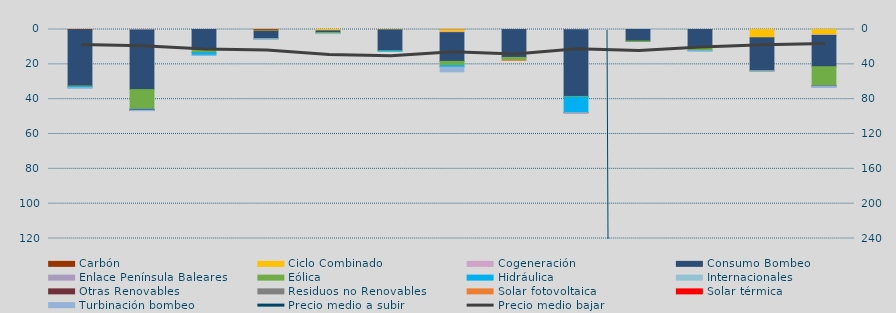
| Category | Carbón | Ciclo Combinado | Cogeneración | Consumo Bombeo | Enlace Península Baleares | Eólica | Hidráulica | Internacionales | Otras Renovables | Residuos no Renovables | Solar fotovoltaica | Solar térmica | Turbinación bombeo |
|---|---|---|---|---|---|---|---|---|---|---|---|---|---|
| 0 | 350.4 | 0 | 0 | 32084.5 | 0 | 425.7 | 531.2 | 0 | 0 | 0 | 0 | 0 | 413.1 |
| 1 | 0 | 90 | 154.4 | 34261.7 | 0 | 11163.7 | 589.5 | 0 | 122.2 | 0 | 0 | 44.1 | 171.5 |
| 2 | 0 | 0 | 0 | 11426.8 | 0 | 1911.2 | 1375.3 | 0 | 0 | 0 | 0 | 0 | 67.5 |
| 3 | 482 | 368.5 | 0 | 4415 | 0 | 113.2 | 0 | 0 | 0 | 0 | 0 | 0 | 368.4 |
| 4 | 0 | 796.6 | 0 | 914.2 | 0 | 550.1 | 8.9 | 0 | 0 | 0 | 0 | 0 | 104 |
| 5 | 0 | 211.3 | 0 | 11981.8 | 0 | 74 | 8.3 | 0 | 0 | 0 | 0 | 0 | 0 |
| 6 | 91.8 | 1302.4 | 400.2 | 16524.6 | 0 | 2415.4 | 873.5 | 0 | 0 | 0 | 0 | 0 | 2690.2 |
| 7 | 0 | 0 | 27.2 | 16019.9 | 60 | 1518.5 | 0 | 0 | 0 | 0 | 0.9 | 0 | 0 |
| 8 | 0 | 0 | 106.8 | 38332.5 | 0 | 408.2 | 8886.3 | 0 | 30.1 | 3.6 | 0 | 0 | 44 |
| 9 | 0 | 0 | 0 | 6628.9 | 0 | 183.2 | 0 | 0 | 0 | 0 | 0 | 0 | 0 |
| 10 | 0 | 1.3 | 0 | 10386.9 | 0 | 1741.8 | 75 | 0 | 0 | 0 | 0 | 0 | 139.3 |
| 11 | 0 | 4765.8 | 1.3 | 18991.8 | 0 | 4.2 | 0 | 0 | 0 | 0 | 0 | 0 | 118 |
| 12 | 0 | 3050.9 | 350.1 | 17978.8 | 0 | 10989.6 | 66.4 | 80 | 170.8 | 0 | 2.7 | 0 | 614.9 |